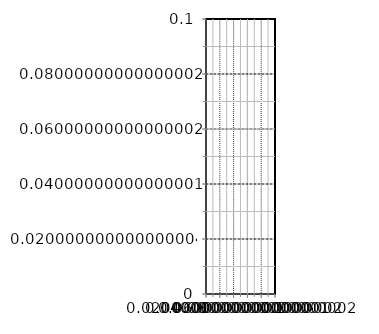
| Category | Series 3 |
|---|---|
| 0 | 1 |